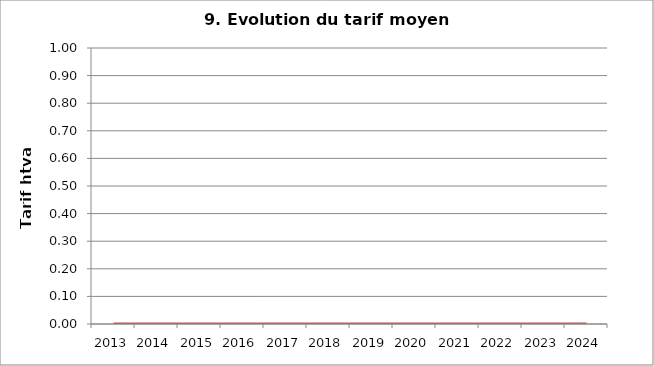
| Category | Tarif htva |
|---|---|
| 2013.0 | 0 |
| 2014.0 | 0 |
| 2015.0 | 0 |
| 2016.0 | 0 |
| 2017.0 | 0 |
| 2018.0 | 0 |
| 2019.0 | 0 |
| 2020.0 | 0 |
| 2021.0 | 0 |
| 2022.0 | 0 |
| 2023.0 | 0 |
| 2024.0 | 0 |